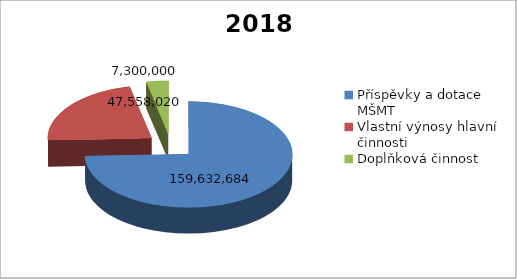
| Category | 2018 |
|---|---|
| Příspěvky a dotace MŠMT | 159632684 |
| Vlastní výnosy hlavní činnosti | 47558020 |
| Doplňková činnost | 7300000 |